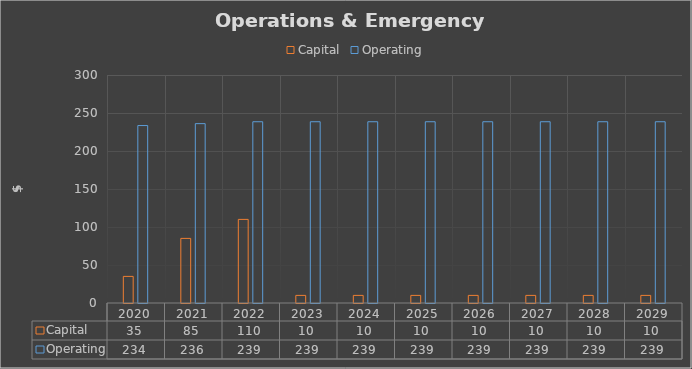
| Category | Capital | Operating |
|---|---|---|
| 2020.0 | 35 | 233.5 |
| 2021.0 | 85 | 236 |
| 2022.0 | 110 | 238.5 |
| 2023.0 | 10 | 238.5 |
| 2024.0 | 10 | 238.5 |
| 2025.0 | 10 | 238.5 |
| 2026.0 | 10 | 238.5 |
| 2027.0 | 10 | 238.5 |
| 2028.0 | 10 | 238.5 |
| 2029.0 | 10 | 238.5 |